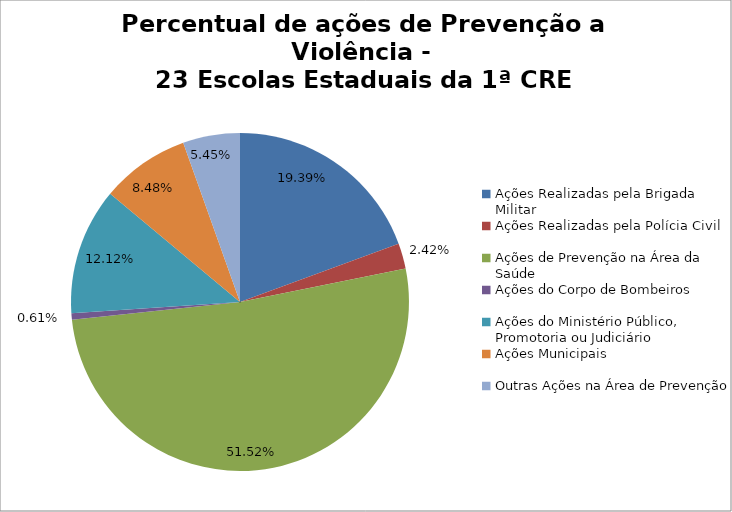
| Category | Percentual |
|---|---|
| Ações Realizadas pela Brigada Militar | 0.194 |
| Ações Realizadas pela Polícia Civil | 0.024 |
| Ações de Prevenção na Área da Saúde | 0.515 |
| Ações do Corpo de Bombeiros | 0.006 |
| Ações do Ministério Público, Promotoria ou Judiciário | 0.121 |
| Ações Municipais | 0.085 |
| Outras Ações na Área de Prevenção | 0.055 |